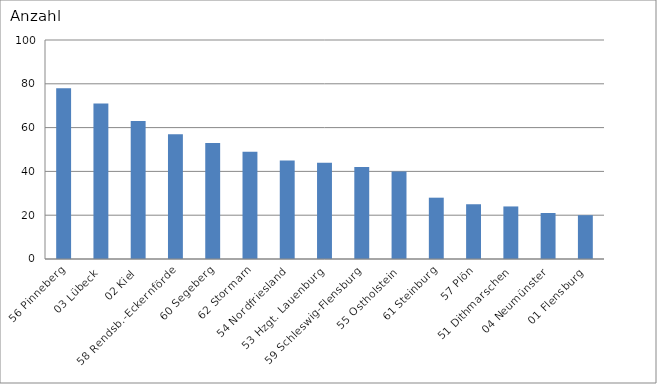
| Category | 56 Pinneberg 03 Lübeck 02 Kiel 58 Rendsb.-Eckernförde 60 Segeberg 62 Stormarn 54 Nordfriesland 53 Hzgt. Lauenburg 59 Schleswig-Flensburg 55 Ostholstein 61 Steinburg 57 Plön 51 Dithmarschen 04 Neumünster 01 Flensburg |
|---|---|
| 56 Pinneberg | 78 |
| 03 Lübeck | 71 |
| 02 Kiel | 63 |
| 58 Rendsb.-Eckernförde | 57 |
| 60 Segeberg | 53 |
| 62 Stormarn | 49 |
| 54 Nordfriesland | 45 |
| 53 Hzgt. Lauenburg | 44 |
| 59 Schleswig-Flensburg | 42 |
| 55 Ostholstein | 40 |
| 61 Steinburg | 28 |
| 57 Plön | 25 |
| 51 Dithmarschen | 24 |
| 04 Neumünster | 21 |
| 01 Flensburg | 20 |